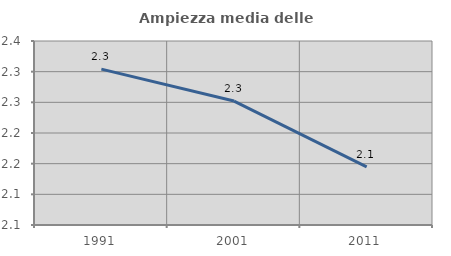
| Category | Ampiezza media delle famiglie |
|---|---|
| 1991.0 | 2.304 |
| 2001.0 | 2.252 |
| 2011.0 | 2.145 |